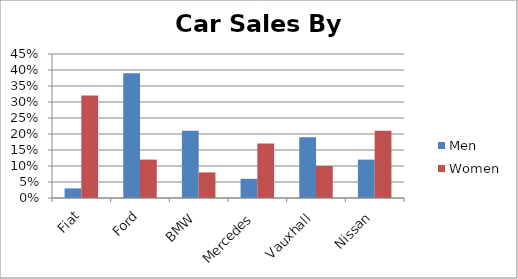
| Category | Men | Women |
|---|---|---|
| Fiat | 0.03 | 0.32 |
| Ford | 0.39 | 0.12 |
| BMW | 0.21 | 0.08 |
| Mercedes | 0.06 | 0.17 |
| Vauxhall | 0.19 | 0.1 |
| Nissan | 0.12 | 0.21 |